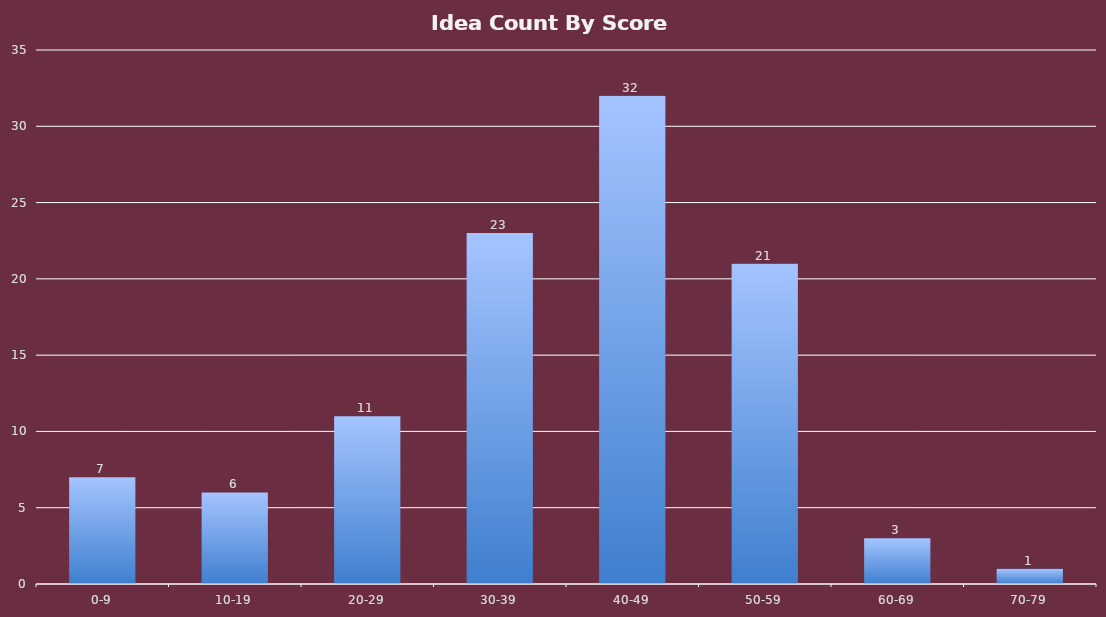
| Category | Total |
|---|---|
| 0-9 | 7 |
| 10-19 | 6 |
| 20-29 | 11 |
| 30-39 | 23 |
| 40-49 | 32 |
| 50-59 | 21 |
| 60-69 | 3 |
| 70-79 | 1 |